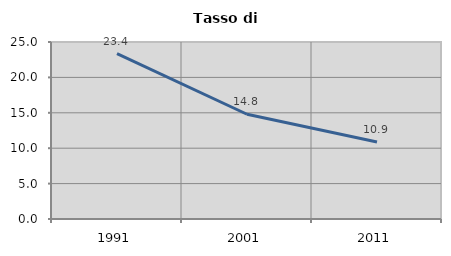
| Category | Tasso di disoccupazione   |
|---|---|
| 1991.0 | 23.351 |
| 2001.0 | 14.795 |
| 2011.0 | 10.883 |